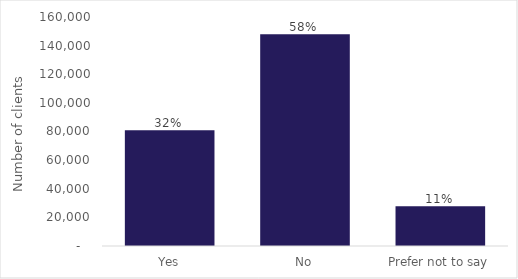
| Category | Series 0 |
|---|---|
| Yes | 80875 |
| No | 147955 |
| Prefer not to say | 27755 |